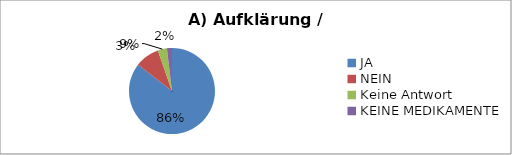
| Category | Series 0 |
|---|---|
| JA | 224 |
| NEIN | 24 |
| Keine Antwort | 9 |
| KEINE MEDIKAMENTE | 5 |